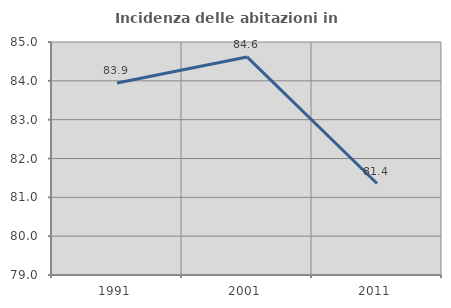
| Category | Incidenza delle abitazioni in proprietà  |
|---|---|
| 1991.0 | 83.946 |
| 2001.0 | 84.615 |
| 2011.0 | 81.356 |